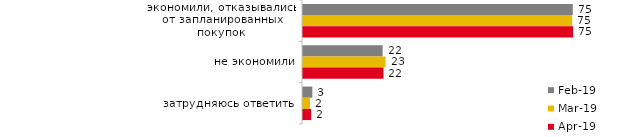
| Category | фев.19 | мар.19 | апр.19 |
|---|---|---|---|
| экономили, отказывались от запланированных покупок | 75.2 | 75.037 | 75.297 |
| не экономили | 22.2 | 23.023 | 22.426 |
| затрудняюсь ответить | 2.6 | 1.939 | 2.277 |